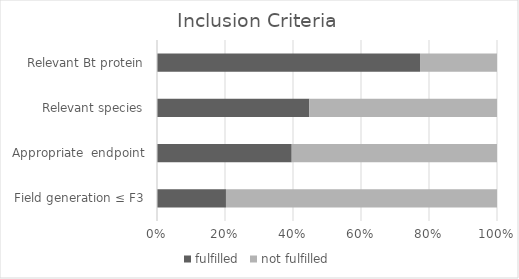
| Category | fulfilled | not fulfilled |
|---|---|---|
|  Field generation ≤ F3 | 43 | 169 |
| Appropriate  endpoint | 84 | 128 |
| Relevant species | 95 | 117 |
| Relevant Bt protein | 164 | 48 |